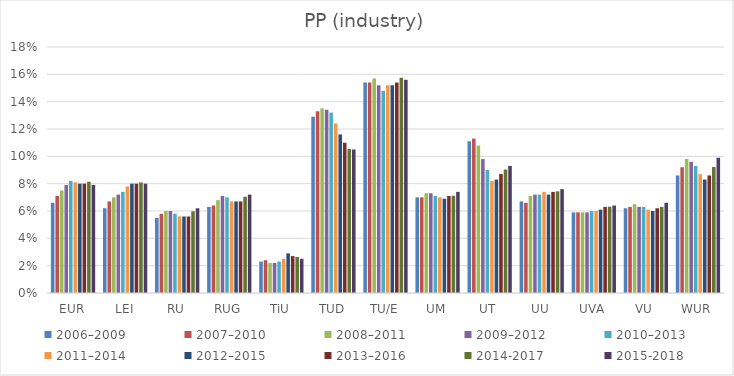
| Category | 2006–2009 | 2007–2010 | 2008–2011 | 2009–2012 | 2010–2013 | 2011–2014 | 2012–2015 | 2013–2016 | 2014-2017 | 2015-2018 |
|---|---|---|---|---|---|---|---|---|---|---|
| EUR | 6.6 | 7.1 | 7.5 | 7.9 | 8.2 | 8.1 | 8 | 8 | 8.14 | 7.9 |
| LEI | 6.2 | 6.7 | 7 | 7.2 | 7.4 | 7.8 | 8 | 8 | 8.093 | 8 |
| RU | 5.5 | 5.8 | 6 | 6 | 5.8 | 5.6 | 5.6 | 5.6 | 5.978 | 6.2 |
| RUG | 6.3 | 6.4 | 6.8 | 7.1 | 7 | 6.7 | 6.7 | 6.7 | 7.042 | 7.2 |
| TiU | 2.3 | 2.4 | 2.2 | 2.2 | 2.3 | 2.5 | 2.9 | 2.7 | 2.634 | 2.5 |
| TUD | 12.9 | 13.3 | 13.5 | 13.4 | 13.2 | 12.4 | 11.6 | 11 | 10.537 | 10.5 |
| TU/E | 15.4 | 15.4 | 15.7 | 15.2 | 14.8 | 15.2 | 15.2 | 15.4 | 15.756 | 15.6 |
| UM | 7 | 7 | 7.3 | 7.3 | 7.1 | 7 | 6.9 | 7.1 | 7.113 | 7.4 |
| UT | 11.1 | 11.3 | 10.8 | 9.8 | 9 | 8.2 | 8.3 | 8.7 | 9.032 | 9.3 |
| UU | 6.7 | 6.6 | 7.1 | 7.2 | 7.2 | 7.4 | 7.2 | 7.4 | 7.438 | 7.6 |
| UVA | 5.9 | 5.9 | 5.9 | 5.9 | 6 | 6 | 6.1 | 6.3 | 6.313 | 6.4 |
| VU | 6.2 | 6.3 | 6.5 | 6.3 | 6.3 | 6.1 | 6 | 6.2 | 6.298 | 6.6 |
| WUR | 8.6 | 9.2 | 9.8 | 9.6 | 9.3 | 8.7 | 8.3 | 8.6 | 9.218 | 9.9 |